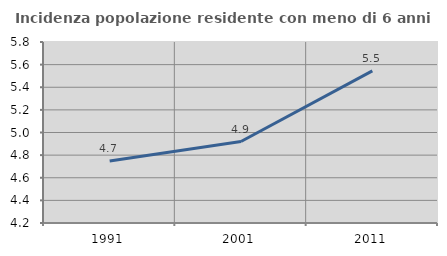
| Category | Incidenza popolazione residente con meno di 6 anni |
|---|---|
| 1991.0 | 4.748 |
| 2001.0 | 4.92 |
| 2011.0 | 5.544 |